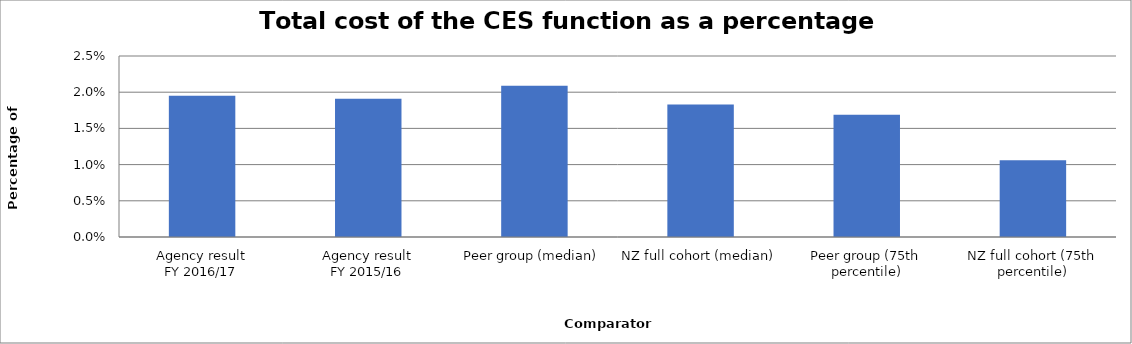
| Category | Result |
|---|---|
| Agency result
FY 2016/17 | 0.02 |
| Agency result
FY 2015/16 | 0.019 |
| Peer group (median) | 0.021 |
| NZ full cohort (median) | 0.018 |
| Peer group (75th percentile) | 0.017 |
| NZ full cohort (75th percentile) | 0.011 |